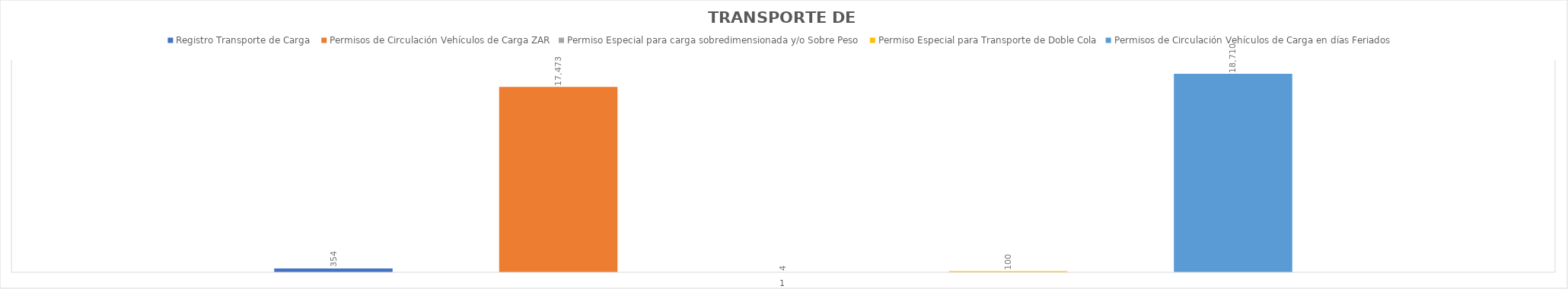
| Category | Registro Transporte de Carga  | Permisos de Circulación Vehículos de Carga ZAR | Permiso Especial para carga sobredimensionada y/o Sobre Peso  | Permiso Especial para Transporte de Doble Cola | Permisos de Circulación Vehículos de Carga en días Feriados  |
|---|---|---|---|---|---|
| 0 | 354 | 17473 | 4 | 100 | 18710 |